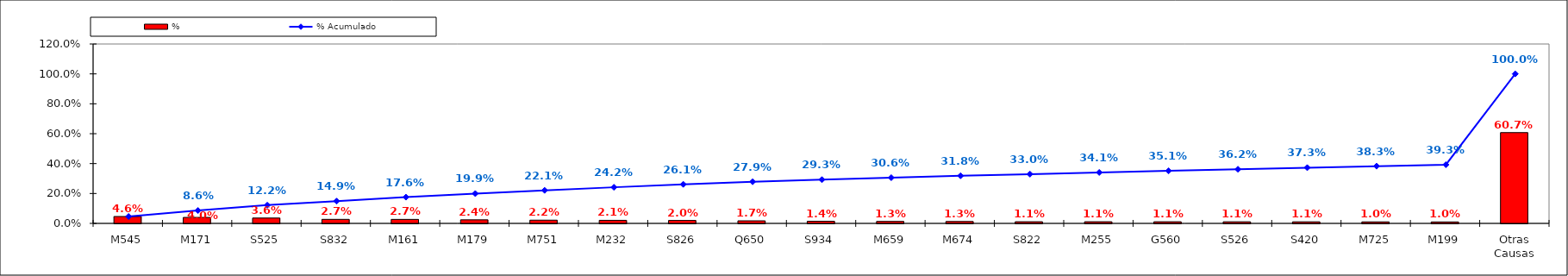
| Category | % |
|---|---|
| M545 | 0.046 |
| M171 | 0.04 |
| S525 | 0.036 |
| S832 | 0.027 |
| M161 | 0.027 |
| M179 | 0.024 |
| M751 | 0.022 |
| M232 | 0.021 |
| S826 | 0.02 |
| Q650 | 0.017 |
| S934 | 0.014 |
| M659 | 0.013 |
| M674 | 0.013 |
| S822 | 0.011 |
| M255 | 0.011 |
| G560 | 0.011 |
| S526 | 0.011 |
| S420 | 0.011 |
| M725 | 0.01 |
| M199 | 0.01 |
| Otras Causas | 0.607 |